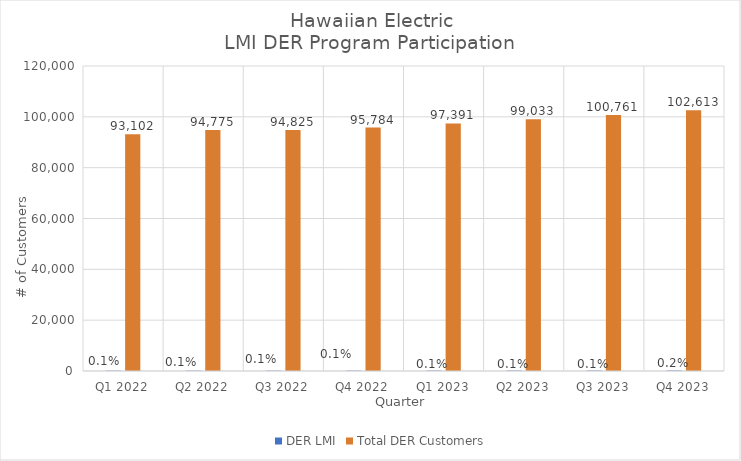
| Category | DER LMI | Total DER Customers |
|---|---|---|
| Q1 2022 | 132 | 93102 |
| Q2 2022 | 136 | 94775 |
| Q3 2022 | 135 | 94825 |
| Q4 2022 | 145 | 95784 |
| Q1 2023 | 172 | 97391 |
| Q2 2023 | 178 | 99033 |
| Q3 2023 | 185 | 100761 |
| Q4 2023 | 201 | 102613 |